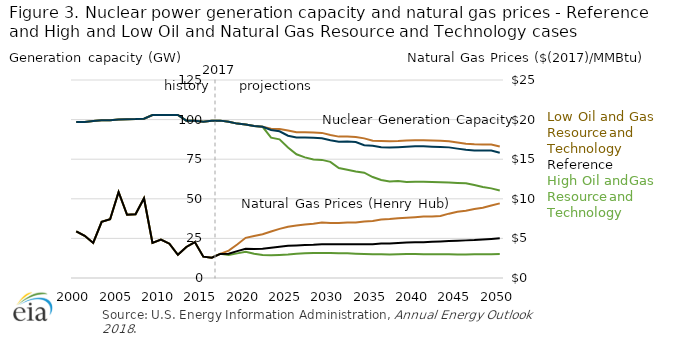
| Category | HRT | LRT | Reference |
|---|---|---|---|
| 2000.0 | 98.447 | 98.447 | 98.447 |
| 2001.0 | 98.487 | 98.487 | 98.487 |
| 2002.0 | 99.07 | 99.07 | 99.07 |
| 2003.0 | 99.513 | 99.513 | 99.513 |
| 2004.0 | 99.647 | 99.647 | 99.647 |
| 2005.0 | 100.021 | 100.021 | 100.021 |
| 2006.0 | 100.192 | 100.192 | 100.192 |
| 2007.0 | 100.321 | 100.321 | 100.321 |
| 2008.0 | 100.58 | 100.58 | 100.58 |
| 2009.0 | 102.884 | 102.884 | 102.884 |
| 2010.0 | 102.884 | 102.884 | 102.884 |
| 2011.0 | 102.884 | 102.884 | 102.884 |
| 2012.0 | 102.884 | 102.884 | 102.884 |
| 2013.0 | 99.308 | 99.308 | 99.308 |
| 2014.0 | 99.308 | 99.308 | 99.308 |
| 2015.0 | 98.704 | 98.704 | 98.704 |
| 2016.0 | 99.348 | 99.348 | 99.348 |
| 2017.0 | 99.348 | 99.348 | 99.348 |
| 2018.0 | 98.646 | 98.646 | 98.646 |
| 2019.0 | 97.474 | 97.474 | 97.474 |
| 2020.0 | 96.94 | 96.94 | 96.94 |
| 2021.0 | 96.029 | 96.029 | 96.029 |
| 2022.0 | 95.441 | 95.441 | 95.441 |
| 2023.0 | 88.575 | 94.19 | 93.404 |
| 2024.0 | 87.549 | 94.132 | 92.604 |
| 2025.0 | 82.376 | 93.179 | 89.844 |
| 2026.0 | 78.121 | 92.061 | 88.726 |
| 2027.0 | 76.166 | 92.056 | 88.722 |
| 2028.0 | 74.862 | 91.927 | 88.593 |
| 2029.0 | 74.559 | 91.606 | 88.272 |
| 2030.0 | 73.298 | 90.247 | 86.98 |
| 2031.0 | 69.394 | 89.26 | 86.061 |
| 2032.0 | 68.372 | 89.364 | 86.164 |
| 2033.0 | 67.233 | 89.017 | 85.84 |
| 2034.0 | 66.509 | 88.157 | 83.85 |
| 2035.0 | 63.738 | 86.626 | 83.526 |
| 2036.0 | 61.919 | 86.471 | 82.526 |
| 2037.0 | 60.997 | 86.339 | 82.411 |
| 2038.0 | 61.223 | 86.486 | 82.567 |
| 2039.0 | 60.537 | 86.753 | 82.834 |
| 2040.0 | 60.815 | 87.031 | 83.112 |
| 2041.0 | 60.815 | 87.031 | 83.112 |
| 2042.0 | 60.62 | 86.816 | 82.897 |
| 2043.0 | 60.425 | 86.6 | 82.681 |
| 2044.0 | 60.23 | 86.385 | 82.466 |
| 2045.0 | 60.034 | 85.598 | 81.679 |
| 2046.0 | 59.853 | 84.827 | 80.908 |
| 2047.0 | 58.698 | 84.472 | 80.561 |
| 2048.0 | 57.51 | 84.319 | 80.415 |
| 2049.0 | 56.584 | 84.319 | 80.415 |
| 2050.0 | 55.296 | 83.031 | 79.128 |